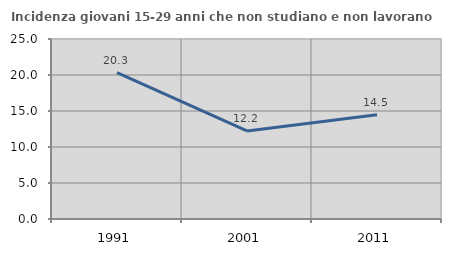
| Category | Incidenza giovani 15-29 anni che non studiano e non lavorano  |
|---|---|
| 1991.0 | 20.32 |
| 2001.0 | 12.229 |
| 2011.0 | 14.478 |